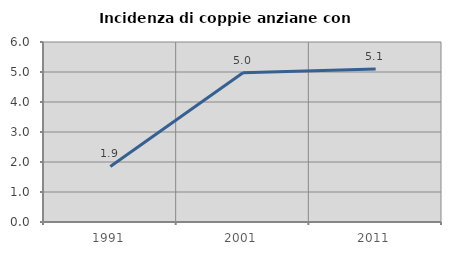
| Category | Incidenza di coppie anziane con figli |
|---|---|
| 1991.0 | 1.852 |
| 2001.0 | 4.972 |
| 2011.0 | 5.102 |